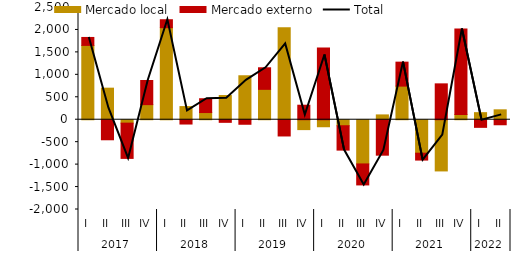
| Category | Mercado local | Mercado externo |
|---|---|---|
| 0 | 1655.56 | 177.301 |
| 1 | 702.963 | -446.607 |
| 2 | -75.967 | -785.675 |
| 3 | 336.364 | 538.061 |
| 4 | 2050.669 | 176.974 |
| 5 | 292.511 | -95.98 |
| 6 | 159.72 | 307.969 |
| 7 | 538.689 | -58.267 |
| 8 | 979.361 | -101.205 |
| 9 | 676.837 | 480.395 |
| 10 | 2049.543 | -361.98 |
| 11 | -220.353 | 323.265 |
| 12 | -156.393 | 1599.437 |
| 13 | -133.868 | -543.113 |
| 14 | -984.868 | -467.691 |
| 15 | 107.247 | -790.064 |
| 16 | 748.563 | 534.137 |
| 17 | -745.582 | -153.332 |
| 18 | -1140.74 | 799.048 |
| 19 | 115.969 | 1903.896 |
| 20 | 157.508 | -169.992 |
| 21 | 220.698 | -112.281 |